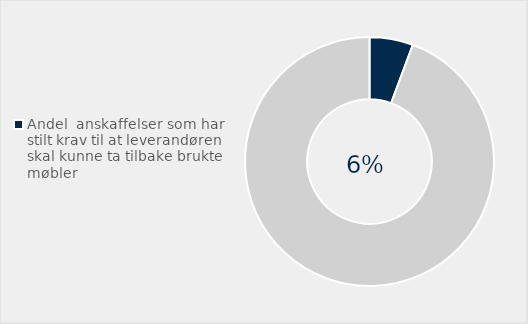
| Category | Series 0 |
|---|---|
| Andel  anskaffelser som har stilt krav til at leverandøren skal kunne ta tilbake brukte møbler | 0.057 |
| Ikke stilt krav  | 0.943 |